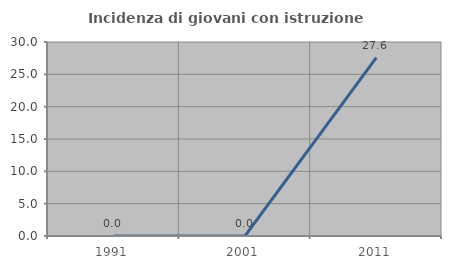
| Category | Incidenza di giovani con istruzione universitaria |
|---|---|
| 1991.0 | 0 |
| 2001.0 | 0 |
| 2011.0 | 27.586 |